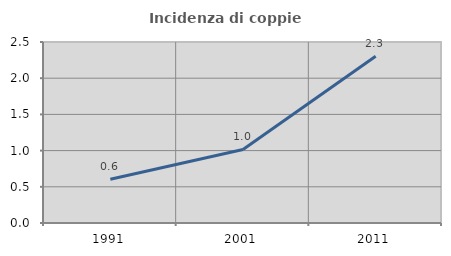
| Category | Incidenza di coppie miste |
|---|---|
| 1991.0 | 0.604 |
| 2001.0 | 1.015 |
| 2011.0 | 2.304 |